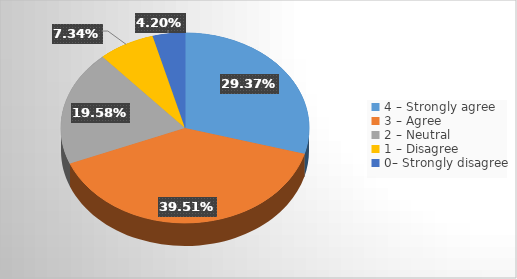
| Category | Series 0 |
|---|---|
| 4 – Strongly agree  | 0.294 |
| 3 – Agree  | 0.395 |
| 2 – Neutral   | 0.196 |
| 1 – Disagree   | 0.073 |
| 0– Strongly disagree | 0.042 |